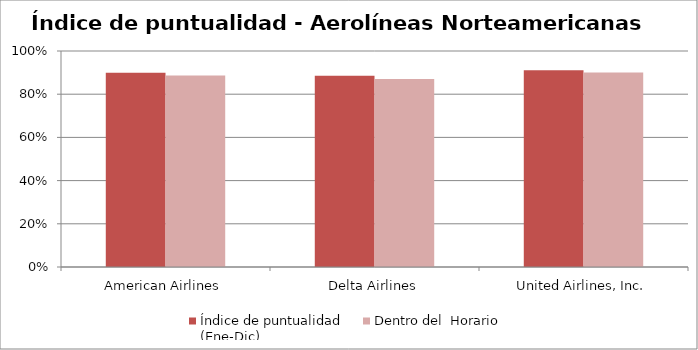
| Category | Índice de puntualidad
(Ene-Dic) | Dentro del  Horario |
|---|---|---|
| American Airlines | 0.899 | 0.887 |
| Delta Airlines | 0.885 | 0.871 |
| United Airlines, Inc. | 0.911 | 0.901 |